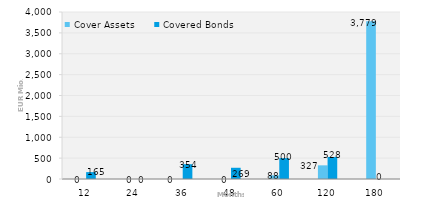
| Category | Cover Assets | Covered Bonds |
|---|---|---|
| 12.0 | 0 | 165 |
| 24.0 | 0 | 0 |
| 36.0 | 0 | 354.35 |
| 48.0 | 0 | 269 |
| 60.0 | 88.082 | 500 |
| 120.0 | 327.163 | 528.047 |
| 180.0 | 3779.154 | 0 |